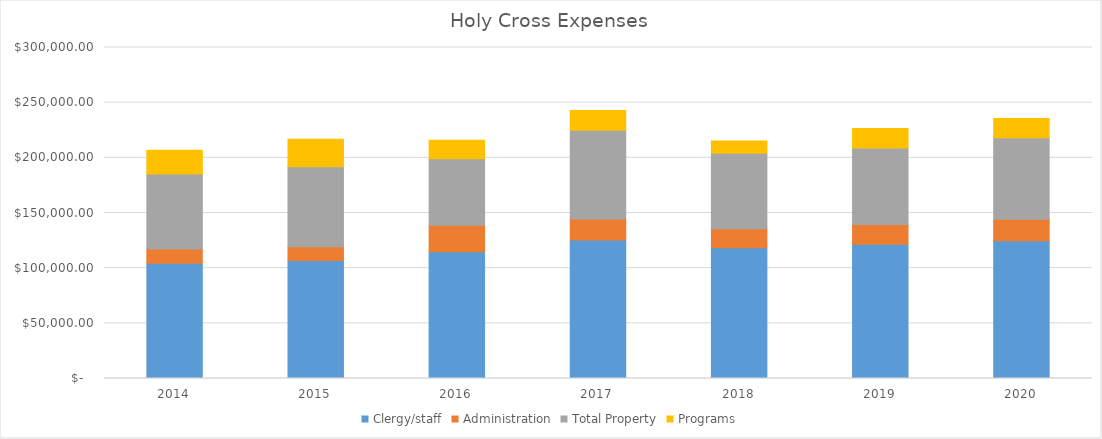
| Category | Clergy/staff | Administration | Total Property | Programs |
|---|---|---|---|---|
| 2014.0 | 104347 | 13054 | 67877 | 21702 |
| 2015.0 | 107030 | 12314 | 72479 | 25031 |
| 2016.0 | 114935 | 23939 | 60381 | 16708 |
| 2017.0 | 125466 | 19171 | 80397 | 17884 |
| 2018.0 | 118403 | 17366 | 68454 | 11027 |
| 2019.0 | 121653 | 18000 | 69365.5 | 17500 |
| 2020.0 | 124903 | 19500 | 73722.05 | 17500 |